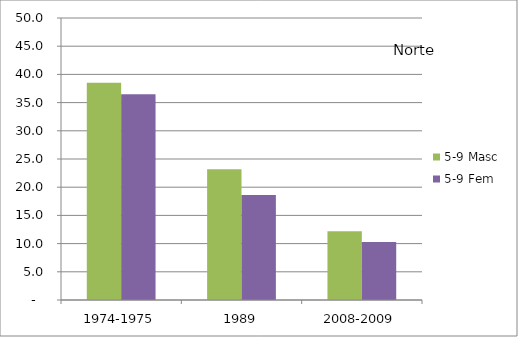
| Category | 5-9 Masc | 5-9 Fem |
|---|---|---|
| 1974-1975 | 38.5 | 36.5 |
| 1989 | 23.2 | 18.6 |
| 2008-2009 | 12.2 | 10.3 |